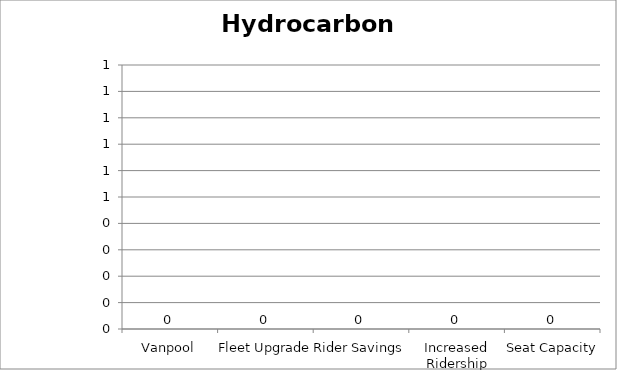
| Category | Hydrocarbons |
|---|---|
| Vanpool | 0 |
| Fleet Upgrade | 0 |
| Rider Savings | 0 |
| Increased Ridership | 0 |
| Seat Capacity | 0 |